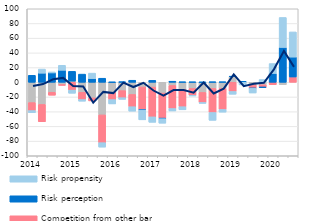
| Category | Costs of funding | Competition from other banks | Risk perception | Risk propensity |
|---|---|---|---|---|
| 2014.0 | -27.614 | -10.883 | 9.484 | -2.931 |
| nan | -30.154 | -23.565 | 12.376 | 5.591 |
| nan | -13.58 | -4.04 | 12.739 | 1.322 |
| nan | -3.194 | -0.943 | 16.324 | 6.815 |
| 2015.0 | 1.584 | -10.634 | 13.285 | -4.309 |
| nan | -13.709 | -9.748 | 11.117 | -2.291 |
| nan | -21.32 | -4.036 | 5.049 | 7.435 |
| nan | -44.371 | -37.787 | 5.514 | -6.068 |
| 2016.0 | -13.683 | -9.865 | 0.112 | -5.896 |
| nan | -11.339 | -9.602 | 0.723 | -2.332 |
| nan | -16.54 | -16.708 | 2.765 | -6.073 |
| nan | -6.439 | -30.804 | -0.484 | -13.396 |
| 2017.0 | -6.563 | -40.484 | 2.656 | -7.434 |
| nan | -14.708 | -34.121 | -0.712 | -6.144 |
| nan | -4.365 | -31.359 | 1.462 | -3.307 |
| nan | -9.63 | -23.589 | 0.436 | -4.267 |
| 2018.0 | -8.401 | -9.465 | 0.383 | -0.758 |
| nan | -13.817 | -13.719 | 0.033 | -1.188 |
| nan | -8.391 | -32.723 | 0.518 | -10.656 |
| nan | -8.386 | -28.581 | 0.546 | -3.682 |
| 2019.0 | 7.614 | -12.529 | 0.567 | -3.764 |
| nan | -0.003 | 0 | 1.352 | -3.594 |
| nan | -3.529 | -4.583 | -0.182 | -6.275 |
| nan | -3.387 | -3.387 | -0.185 | 3.746 |
| 2020.0 | 0 | -3.3 | 12 | 13.5 |
| nan | -3.3 | 0 | 47.4 | 40.8 |
| nan | 0 | 7.2 | 27.1 | 34.2 |